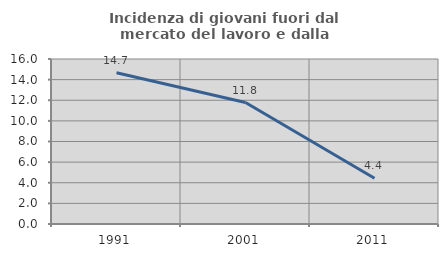
| Category | Incidenza di giovani fuori dal mercato del lavoro e dalla formazione  |
|---|---|
| 1991.0 | 14.66 |
| 2001.0 | 11.777 |
| 2011.0 | 4.439 |